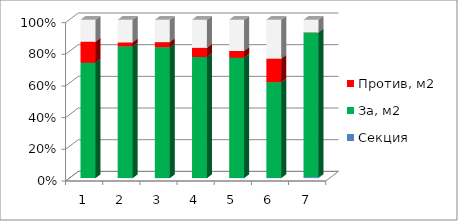
| Category | Секция | За, м2 | Против, м2 | Возд., м2 |
|---|---|---|---|---|
| 0 | 1 | 2564.412 | 466.55 | 489.05 |
| 1 | 2 | 2841.38 | 84.8 | 490.3 |
| 2 | 3 | 3076.869 | 120.8 | 527 |
| 3 | 4 | 2371.18 | 179.32 | 551.38 |
| 4 | 5 | 2734.08 | 153.8 | 711.12 |
| 5 | 6 | 1428.3 | 353.8 | 581.25 |
| 6 | 7 | 1020.3 | 0 | 90.1 |